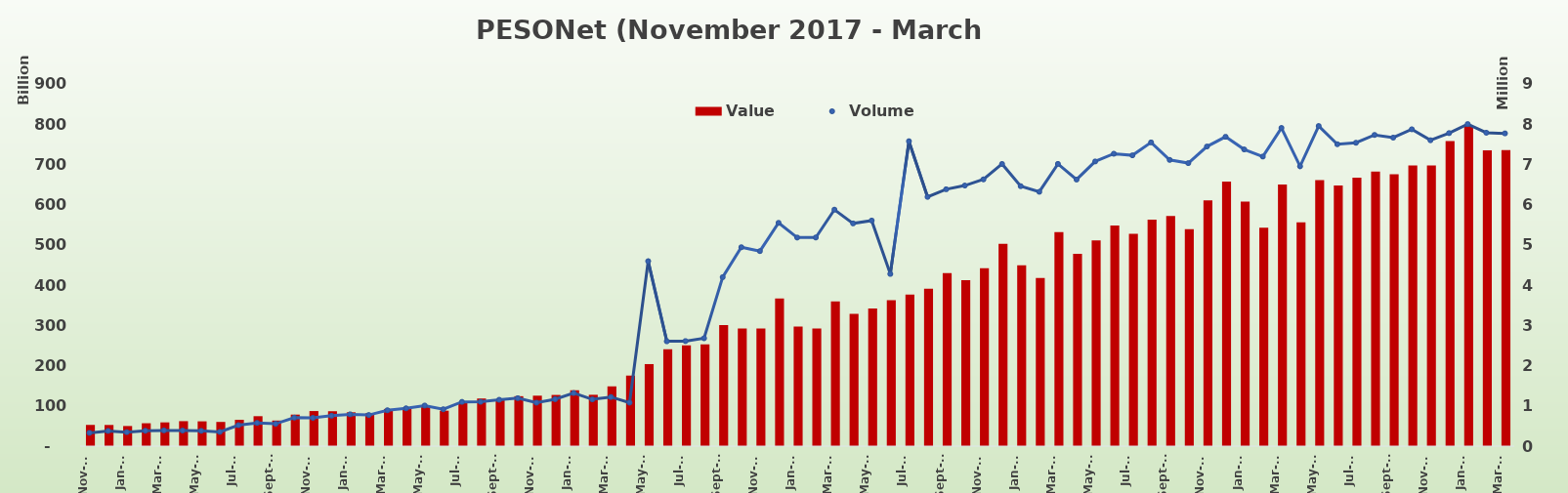
| Category | Value |
|---|---|
| 2017-11-30 | 52763876332.32 |
| 2017-12-31 | 52594679537.7 |
| 2018-01-31 | 49995532439.49 |
| 2018-02-28 | 56890524976.98 |
| 2018-03-31 | 59037981958.85 |
| 2018-04-30 | 62055967772 |
| 2018-05-31 | 61621158810.81 |
| 2018-06-30 | 60144279685.11 |
| 2018-07-31 | 65531742753.47 |
| 2018-08-31 | 74449841656.73 |
| 2018-09-30 | 63596892509.38 |
| 2018-10-31 | 78370630515.49 |
| 2018-11-30 | 87190769788.77 |
| 2018-12-31 | 86768829503.91 |
| 2019-01-31 | 84087373468.52 |
| 2019-02-28 | 81839001917.96 |
| 2019-03-31 | 92441113334.08 |
| 2019-04-30 | 93545126607.28 |
| 2019-05-31 | 99169964125.72 |
| 2019-06-30 | 88103695918.9 |
| 2019-07-31 | 108910374316.32 |
| 2019-08-31 | 118356303949.16 |
| 2019-09-30 | 115910267080.8 |
| 2019-10-31 | 124090290143.15 |
| 2019-11-30 | 125400691466.51 |
| 2019-12-31 | 127212716320.15 |
| 2020-01-31 | 138879663103.09 |
| 2020-02-29 | 127606609632.45 |
| 2020-03-31 | 148548046932.88 |
| 2020-04-30 | 175331898478.84 |
| 2020-05-31 | 203856865235.75 |
| 2020-06-30 | 240595275435.4 |
| 2020-07-31 | 250752363338 |
| 2020-08-31 | 252869218827.38 |
| 2020-09-30 | 301023045655.52 |
| 2020-10-31 | 292500371492.59 |
| 2020-11-30 | 292468505809.4 |
| 2020-12-31 | 366638228153.01 |
| 2021-01-31 | 297458990051.33 |
| 2021-02-28 | 292384480205.53 |
| 2021-03-31 | 359727346907.75 |
| 2021-04-30 | 328675907783.07 |
| 2021-05-31 | 341837407316.49 |
| 2021-06-30 | 362528476338.42 |
| 2021-07-31 | 376518709587.91 |
| 2021-08-31 | 390943997095.38 |
| 2021-09-30 | 429920601299.74 |
| 2021-10-31 | 412417351663.73 |
| 2021-11-30 | 441851619814.94 |
| 2021-12-31 | 502929781424.59 |
| 2022-01-31 | 449346433704.98 |
| 2022-02-28 | 418028200639.14 |
| 2022-03-31 | 531842985947.23 |
| 2022-04-30 | 477907959500.36 |
| 2022-05-31 | 511349137528.99 |
| 2022-06-30 | 548116420510.29 |
| 2022-07-31 | 527377234854.87 |
| 2022-08-31 | 562858089896.31 |
| 2022-09-30 | 572049621383.83 |
| 2022-10-31 | 539045467084.88 |
| 2022-11-30 | 610554357551.6 |
| 2022-12-31 | 657691263287.531 |
| 2023-01-31 | 607861379277.22 |
| 2023-02-28 | 542678209161.1 |
| 2023-03-31 | 650068861485.85 |
| 2023-04-30 | 556118053406.34 |
| 2023-05-31 | 660753292495.9 |
| 2023-06-30 | 647415230798.61 |
| 2023-07-31 | 666892733799.02 |
| 2023-08-31 | 682555118224.439 |
| 2023-09-30 | 675453798247.39 |
| 2023-10-31 | 697205233842.67 |
| 2023-11-30 | 697297968201.6 |
| 2023-12-31 | 758068926729.96 |
| 2024-01-31 | 797376637973.119 |
| 2024-02-29 | 735129780178.97 |
| 2024-03-31 | 735421631918.05 |